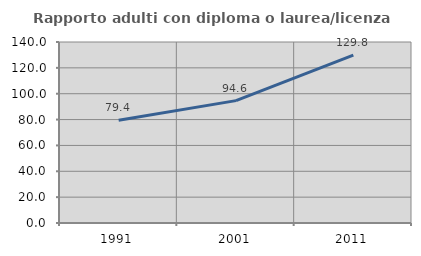
| Category | Rapporto adulti con diploma o laurea/licenza media  |
|---|---|
| 1991.0 | 79.443 |
| 2001.0 | 94.643 |
| 2011.0 | 129.826 |